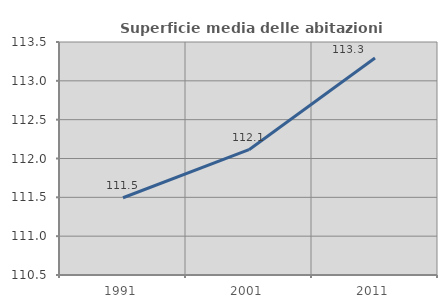
| Category | Superficie media delle abitazioni occupate |
|---|---|
| 1991.0 | 111.495 |
| 2001.0 | 112.113 |
| 2011.0 | 113.294 |